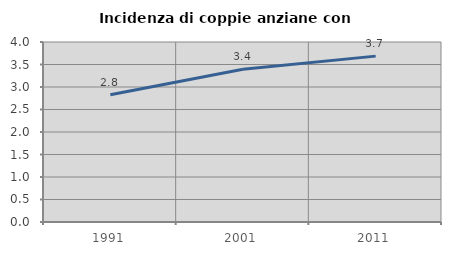
| Category | Incidenza di coppie anziane con figli |
|---|---|
| 1991.0 | 2.826 |
| 2001.0 | 3.393 |
| 2011.0 | 3.686 |